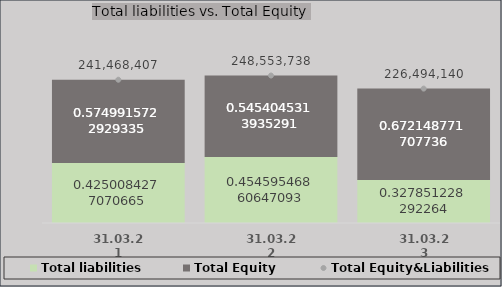
| Category | Total liabilities | Total Equity |
|---|---|---|
| 31.03.21 | 102626108 | 138842299 |
| 31.03.22 | 112991403 | 135562335 |
| 31.03.23 | 74256382 | 152237758 |